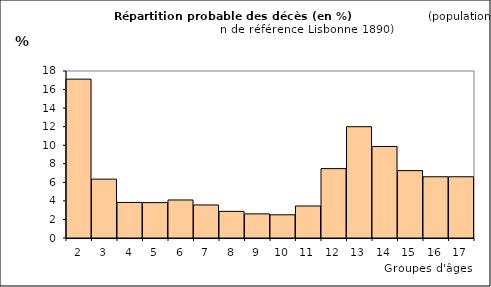
| Category | Series 0 |
|---|---|
| 2.0 | 17.121 |
| 3.0 | 6.345 |
| 4.0 | 3.832 |
| 5.0 | 3.814 |
| 6.0 | 4.099 |
| 7.0 | 3.562 |
| 8.0 | 2.87 |
| 9.0 | 2.6 |
| 10.0 | 2.5 |
| 11.0 | 3.451 |
| 12.0 | 7.479 |
| 13.0 | 11.997 |
| 14.0 | 9.867 |
| 15.0 | 7.262 |
| 16.0 | 6.601 |
| 17.0 | 6.601 |